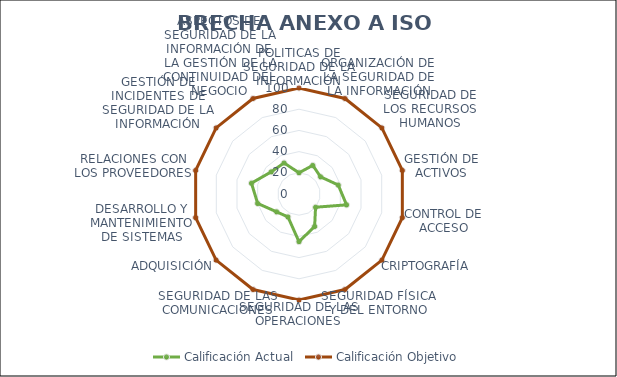
| Category | Calificación Actual | Calificación Objetivo |
|---|---|---|
| 0 | 20 | 100 |
| 1 | 30 | 100 |
| 2 | 26 | 100 |
| 3 | 38 | 100 |
| 4 | 46 | 100 |
| 5 | 20 | 100 |
| 6 | 34 | 100 |
| 7 | 45 | 100 |
| 8 | 24 | 100 |
| 9 | 27 | 100 |
| 10 | 40 | 100 |
| 11 | 46 | 100 |
| 12 | 33.5 | 100 |
| 13 | 32.5 | 100 |